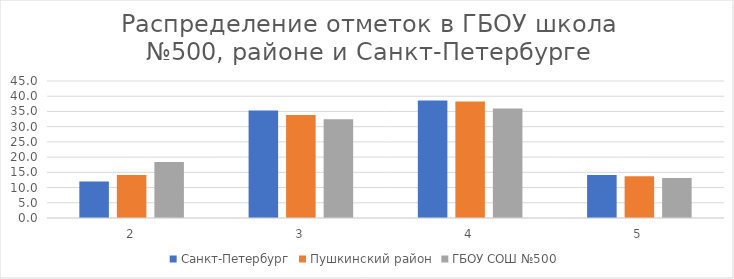
| Category | Санкт-Петербург | Пушкинский район | ГБОУ СОШ №500 |
|---|---|---|---|
| 2.0 | 12.02 | 14.1 | 18.42 |
| 3.0 | 35.27 | 33.85 | 32.46 |
| 4.0 | 38.58 | 38.3 | 35.96 |
| 5.0 | 14.13 | 13.75 | 13.16 |